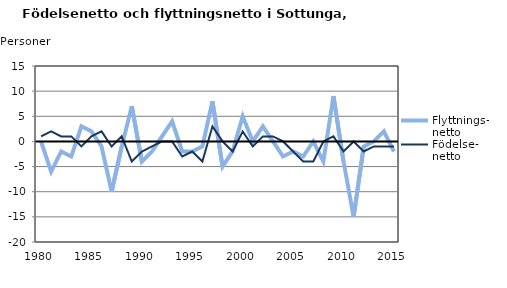
| Category | Flyttnings- netto | Födelse- netto |
|---|---|---|
| 1980.0 | 0 | 1 |
| 1981.0 | -6 | 2 |
| 1982.0 | -2 | 1 |
| 1983.0 | -3 | 1 |
| 1984.0 | 3 | -1 |
| 1985.0 | 2 | 1 |
| 1986.0 | -1 | 2 |
| 1987.0 | -10 | -1 |
| 1988.0 | -1 | 1 |
| 1989.0 | 7 | -4 |
| 1990.0 | -4 | -2 |
| 1991.0 | -2 | -1 |
| 1992.0 | 1 | 0 |
| 1993.0 | 4 | 0 |
| 1994.0 | -2 | -3 |
| 1995.0 | -2 | -2 |
| 1996.0 | -1 | -4 |
| 1997.0 | 8 | 3 |
| 1998.0 | -5 | 0 |
| 1999.0 | -2 | -2 |
| 2000.0 | 5 | 2 |
| 2001.0 | 0 | -1 |
| 2002.0 | 3 | 1 |
| 2003.0 | 0 | 1 |
| 2004.0 | -3 | 0 |
| 2005.0 | -2 | -2 |
| 2006.0 | -3 | -4 |
| 2007.0 | 0 | -4 |
| 2008.0 | -4 | 0 |
| 2009.0 | 9 | 1 |
| 2010.0 | -4 | -2 |
| 2011.0 | -15 | 0 |
| 2012.0 | -1 | -2 |
| 2013.0 | 0 | -1 |
| 2014.0 | 2 | -1 |
| 2015.0 | -2 | -1 |